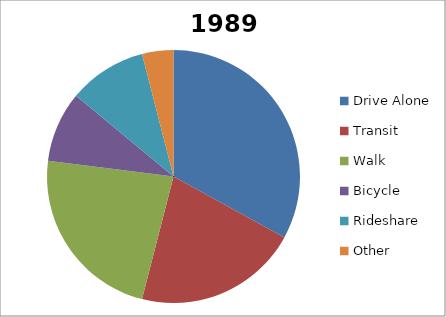
| Category | 1989 |
|---|---|
| Drive Alone | 33 |
| Transit | 21 |
| Walk | 23 |
| Bicycle | 9 |
| Rideshare | 10 |
| Other | 4 |